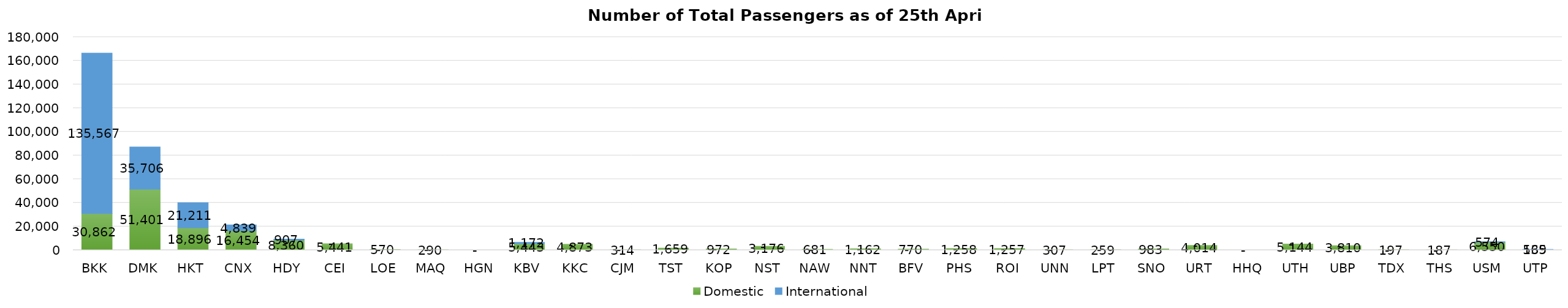
| Category | Domestic | International |
|---|---|---|
| BKK | 30862 | 135567 |
| DMK | 51401 | 35706 |
| HKT | 18896 | 21211 |
| CNX | 16454 | 4839 |
| HDY | 8360 | 907 |
| CEI | 5441 | 0 |
| LOE | 570 | 0 |
| MAQ | 290 | 0 |
| HGN | 0 | 0 |
| KBV | 5443 | 1172 |
| KKC | 4873 | 0 |
| CJM | 314 | 0 |
| TST | 1659 | 0 |
| KOP | 972 | 0 |
| NST | 3176 | 0 |
| NAW | 681 | 0 |
| NNT | 1162 | 0 |
| BFV | 770 | 0 |
| PHS | 1258 | 0 |
| ROI | 1257 | 0 |
| UNN | 307 | 0 |
| LPT | 259 | 0 |
| SNO | 983 | 0 |
| URT | 4014 | 0 |
| HHQ | 0 | 0 |
| UTH | 5144 | 0 |
| UBP | 3810 | 0 |
| TDX | 197 | 0 |
| THS | 187 | 0 |
| USM | 6550 | 574 |
| UTP | 569 | 135 |